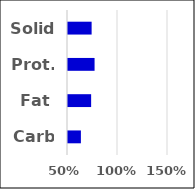
| Category | Value |
|---|---|
| Carb | 0.629 |
| Fat | 0.731 |
| Prot. | 0.766 |
| Solid | 0.736 |